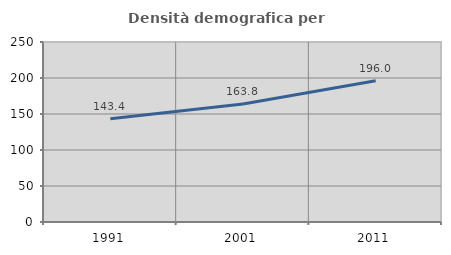
| Category | Densità demografica |
|---|---|
| 1991.0 | 143.413 |
| 2001.0 | 163.816 |
| 2011.0 | 196.047 |